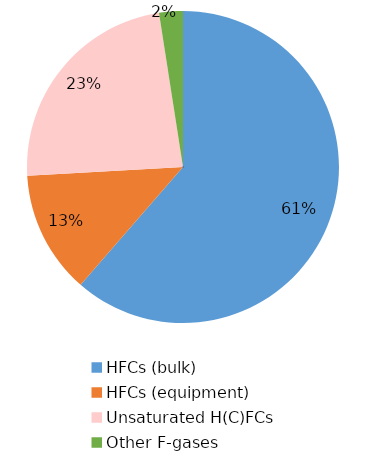
| Category | % Tonnes |
|---|---|
| HFCs (bulk) | 0.614 |
| HFCs (equipment) | 0.127 |
| Unsaturated H(C)FCs | 0.234 |
| Other F-gases | 0.025 |